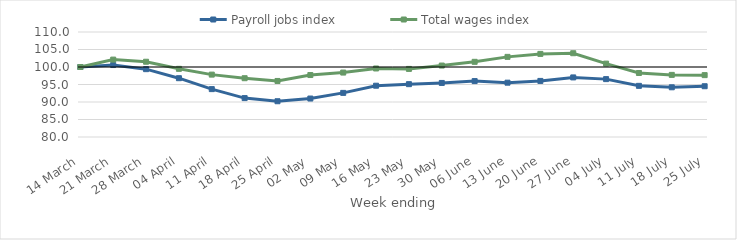
| Category | Payroll jobs index | Total wages index |
|---|---|---|
| 2020-03-14 | 100 | 100 |
| 2020-03-21 | 100.56 | 102.112 |
| 2020-03-28 | 99.381 | 101.503 |
| 2020-04-04 | 96.803 | 99.478 |
| 2020-04-11 | 93.68 | 97.824 |
| 2020-04-18 | 91.113 | 96.797 |
| 2020-04-25 | 90.217 | 96.012 |
| 2020-05-02 | 90.988 | 97.704 |
| 2020-05-09 | 92.607 | 98.408 |
| 2020-05-16 | 94.656 | 99.576 |
| 2020-05-23 | 95.095 | 99.455 |
| 2020-05-30 | 95.446 | 100.412 |
| 2020-06-06 | 95.977 | 101.481 |
| 2020-06-13 | 95.521 | 102.894 |
| 2020-06-20 | 96.022 | 103.744 |
| 2020-06-27 | 97.023 | 103.933 |
| 2020-07-04 | 96.536 | 100.967 |
| 2020-07-11 | 94.616 | 98.289 |
| 2020-07-18 | 94.205 | 97.747 |
| 2020-07-25 | 94.505 | 97.674 |